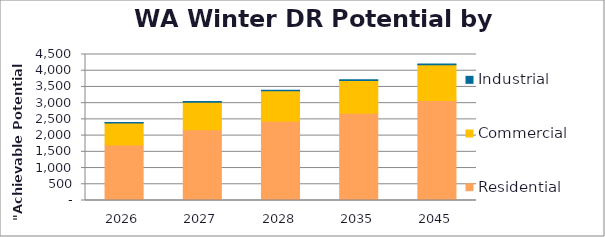
| Category |  Residential  | Commercial | Industrial |
|---|---|---|---|
| 2026.0 | 1711.274 | 679.024 | 16.291 |
| 2027.0 | 2180.617 | 851.359 | 17.948 |
| 2028.0 | 2439.889 | 943.005 | 18.97 |
| 2035.0 | 2692.79 | 1005.496 | 21.571 |
| 2045.0 | 3079.564 | 1102.018 | 25.915 |